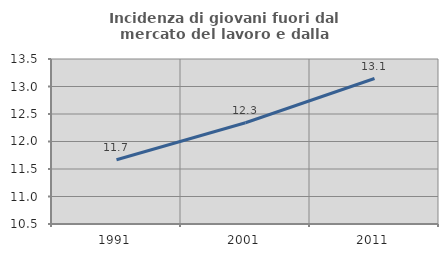
| Category | Incidenza di giovani fuori dal mercato del lavoro e dalla formazione  |
|---|---|
| 1991.0 | 11.668 |
| 2001.0 | 12.341 |
| 2011.0 | 13.145 |